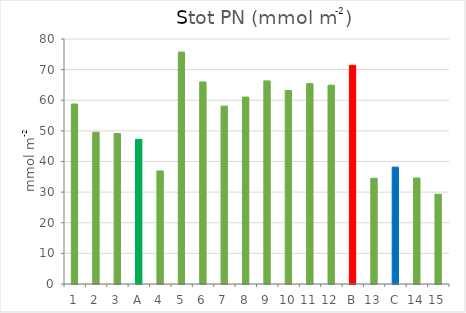
| Category | Stot PC (mmol m-2) |
|---|---|
| 1 | 58.775 |
| 2 | 49.565 |
| 3 | 49.135 |
| A | 47.24 |
| 4 | 36.91 |
| 5 | 75.725 |
| 6 | 65.975 |
| 7 | 58.08 |
| 8 | 61.035 |
| 9 | 66.325 |
| 10 | 63.15 |
| 11 | 65.42 |
| 12 | 64.91 |
| B | 71.38 |
| 13 | 34.516 |
| C | 38.153 |
| 14 | 34.621 |
| 15 | 29.316 |